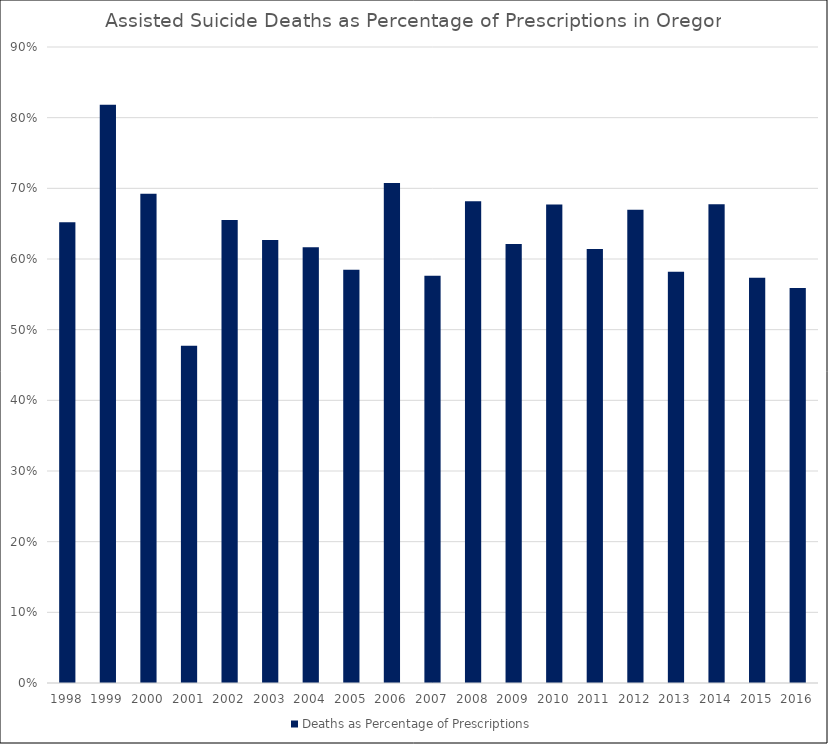
| Category | Deaths as Percentage of Prescriptions |
|---|---|
| 1998 | 0.652 |
| 1999 | 0.818 |
| 2000 | 0.692 |
| 2001 | 0.477 |
| 2002 | 0.655 |
| 2003 | 0.627 |
| 2004 | 0.617 |
| 2005 | 0.585 |
| 2006 | 0.708 |
| 2007 | 0.576 |
| 2008 | 0.682 |
| 2009 | 0.621 |
| 2010 | 0.677 |
| 2011 | 0.614 |
| 2012 | 0.67 |
| 2013 | 0.582 |
| 2014 | 0.677 |
| 2015 | 0.573 |
| 2016 | 0.559 |